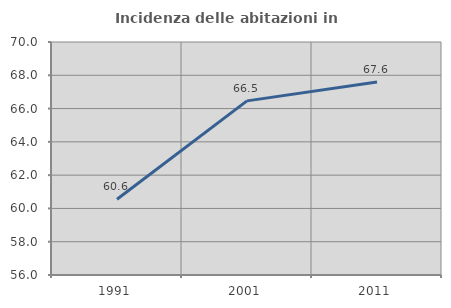
| Category | Incidenza delle abitazioni in proprietà  |
|---|---|
| 1991.0 | 60.554 |
| 2001.0 | 66.463 |
| 2011.0 | 67.598 |